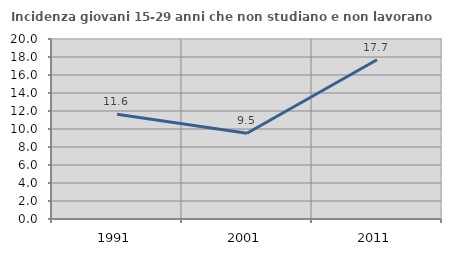
| Category | Incidenza giovani 15-29 anni che non studiano e non lavorano  |
|---|---|
| 1991.0 | 11.644 |
| 2001.0 | 9.524 |
| 2011.0 | 17.699 |